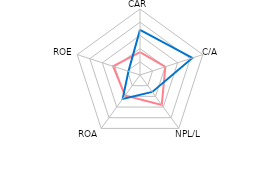
| Category | Serbia | Region |
|---|---|---|
| CAR | 1.732 | 3.42 |
| C/A | 2.018 | 4.172 |
| NPL/L | 2.804 | 1.582 |
| ROA | 1.92 | 2.235 |
| ROE | 2.146 | 0.918 |